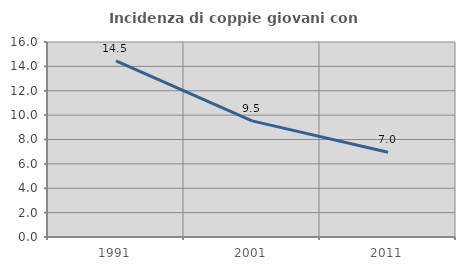
| Category | Incidenza di coppie giovani con figli |
|---|---|
| 1991.0 | 14.456 |
| 2001.0 | 9.526 |
| 2011.0 | 6.952 |